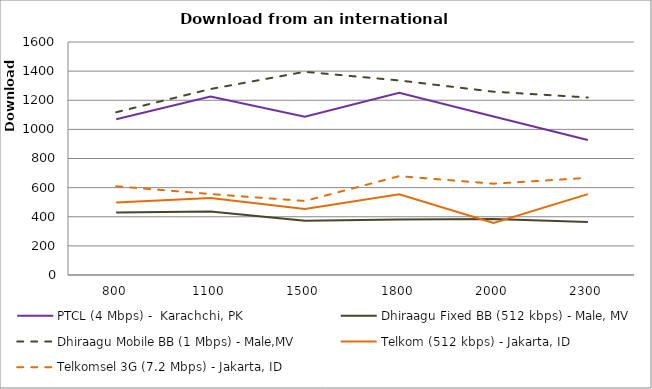
| Category | PTCL (4 Mbps) -  Karachchi, PK | Dhiraagu Fixed BB (512 kbps) - Male, MV | Dhiraagu Mobile BB (1 Mbps) - Male,MV | Telkom (512 kbps) - Jakarta, ID | Telkomsel 3G (7.2 Mbps) - Jakarta, ID |
|---|---|---|---|---|---|
| 800.0 | 1070 | 428.462 | 1117.615 | 497.333 | 609.333 |
| 1100.0 | 1225.286 | 436.667 | 1277.083 | 529 | 556 |
| 1500.0 | 1087.167 | 372.692 | 1395.462 | 453.4 | 508.25 |
| 1800.0 | 1251.714 | 381.462 | 1336 | 553.833 | 679 |
| 2000.0 | 1088.167 | 384.667 | 1258.692 | 357.5 | 627 |
| 2300.0 | 927.167 | 363.25 | 1219.154 | 555.5 | 667.25 |